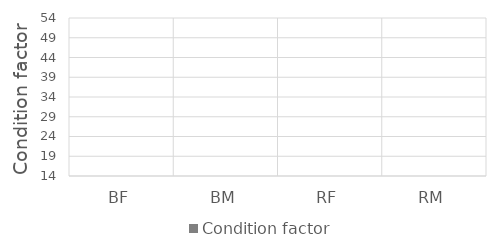
| Category | Condition factor |
|---|---|
| BF | 0 |
| BM | 0 |
| RF | 0 |
| RM | 0 |